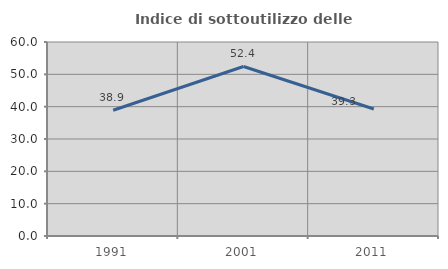
| Category | Indice di sottoutilizzo delle abitazioni  |
|---|---|
| 1991.0 | 38.889 |
| 2001.0 | 52.427 |
| 2011.0 | 39.286 |